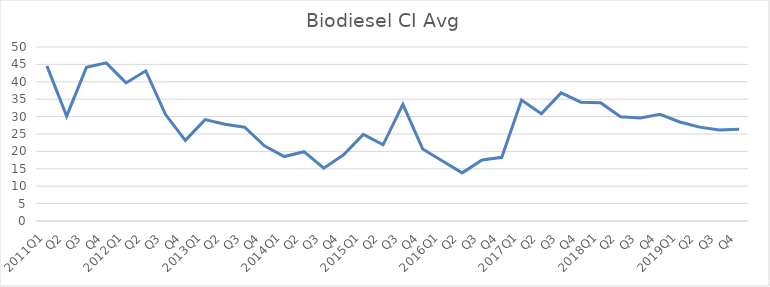
| Category | Series 0 |
|---|---|
| 2011Q1 | 44.57 |
| Q2 | 30.14 |
| Q3 | 44.16 |
| Q4 | 45.45 |
| 2012Q1 | 39.68 |
| Q2 | 43.15 |
| Q3 | 30.58 |
| Q4 | 23.16 |
| 2013Q1 | 29.14 |
| Q2 | 27.78 |
| Q3 | 26.97 |
| Q4 | 21.59 |
| 2014Q1 | 18.52 |
| Q2 | 19.91 |
| Q3 | 15.16 |
| Q4 | 19.04 |
| 2015Q1 | 24.88 |
| Q2 | 21.9 |
| Q3 | 33.51 |
| Q4 | 20.7 |
| 2016Q1 | 17.25 |
| Q2 | 13.83 |
| Q3 | 17.53 |
| Q4 | 18.31 |
| 2017Q1 | 34.76 |
| Q2 | 30.84 |
| Q3 | 36.82 |
| Q4 | 34.15 |
| 2018Q1 | 33.97 |
| Q2 | 29.93 |
| Q3 | 29.61 |
| Q4 | 30.67 |
| 2019Q1 | 28.46 |
| Q2 | 26.98 |
| Q3 | 26.15 |
| Q4 | 26.34 |